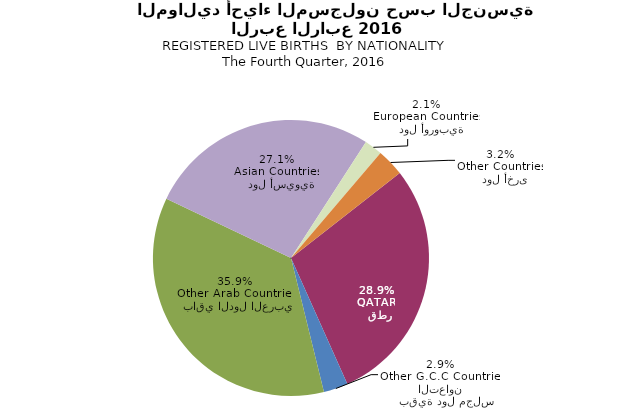
| Category | Series 0 |
|---|---|
|   قطر
QATAR | 2039 |
|   بقية دول مجلس التعاون
Other G.C.C Countries | 202 |
|   باقي الدول العربية
Other Arab Countries | 2537 |
|   دول أسيوية
Asian Countries | 1912 |
|   دول أوروبية
European Countries | 148 |
|   دول أخرى
Other Countries | 227 |